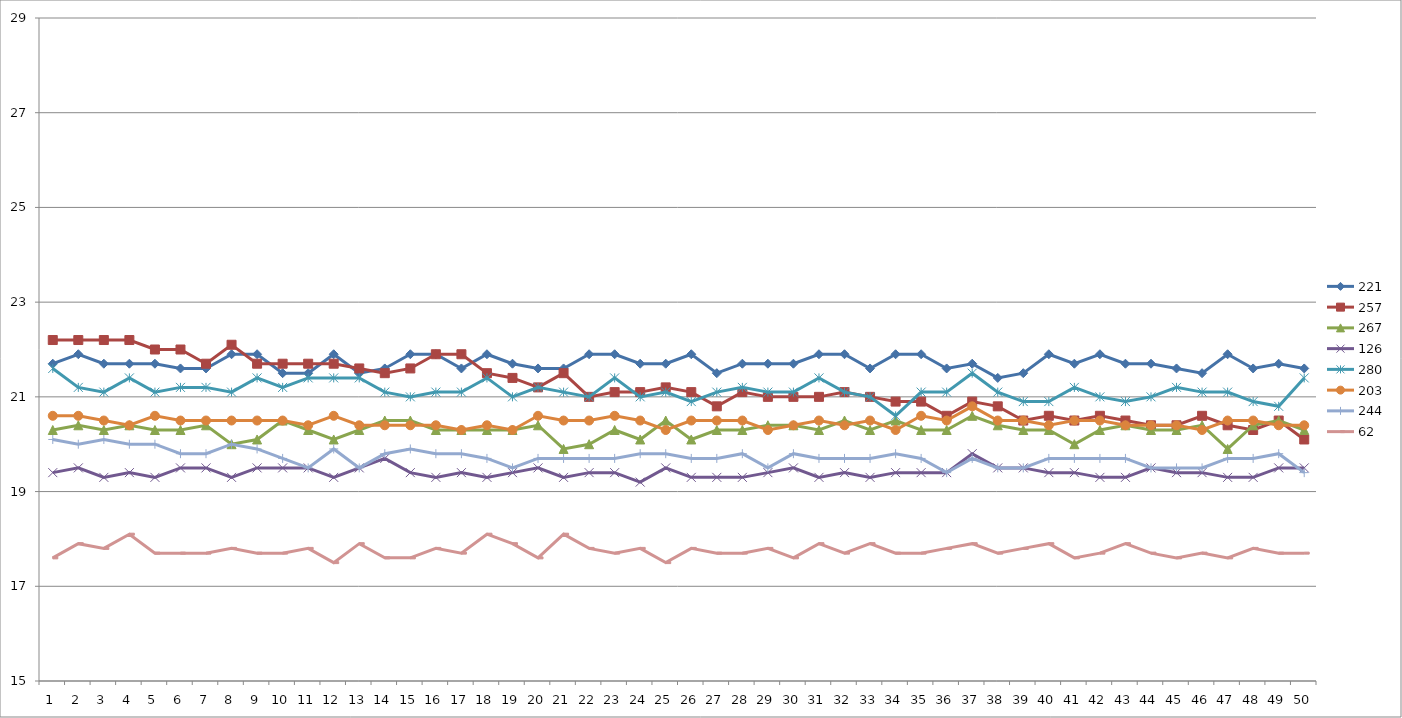
| Category | 221 | 257 | 267 | 126 | 280 | 203 | 244 | 62 |
|---|---|---|---|---|---|---|---|---|
| 0 | 21.7 | 22.2 | 20.3 | 19.4 | 21.6 | 20.6 | 20.1 | 17.6 |
| 1 | 21.9 | 22.2 | 20.4 | 19.5 | 21.2 | 20.6 | 20 | 17.9 |
| 2 | 21.7 | 22.2 | 20.3 | 19.3 | 21.1 | 20.5 | 20.1 | 17.8 |
| 3 | 21.7 | 22.2 | 20.4 | 19.4 | 21.4 | 20.4 | 20 | 18.1 |
| 4 | 21.7 | 22 | 20.3 | 19.3 | 21.1 | 20.6 | 20 | 17.7 |
| 5 | 21.6 | 22 | 20.3 | 19.5 | 21.2 | 20.5 | 19.8 | 17.7 |
| 6 | 21.6 | 21.7 | 20.4 | 19.5 | 21.2 | 20.5 | 19.8 | 17.7 |
| 7 | 21.9 | 22.1 | 20 | 19.3 | 21.1 | 20.5 | 20 | 17.8 |
| 8 | 21.9 | 21.7 | 20.1 | 19.5 | 21.4 | 20.5 | 19.9 | 17.7 |
| 9 | 21.5 | 21.7 | 20.5 | 19.5 | 21.2 | 20.5 | 19.7 | 17.7 |
| 10 | 21.5 | 21.7 | 20.3 | 19.5 | 21.4 | 20.4 | 19.5 | 17.8 |
| 11 | 21.9 | 21.7 | 20.1 | 19.3 | 21.4 | 20.6 | 19.9 | 17.5 |
| 12 | 21.5 | 21.6 | 20.3 | 19.5 | 21.4 | 20.4 | 19.5 | 17.9 |
| 13 | 21.6 | 21.5 | 20.5 | 19.7 | 21.1 | 20.4 | 19.8 | 17.6 |
| 14 | 21.9 | 21.6 | 20.5 | 19.4 | 21 | 20.4 | 19.9 | 17.6 |
| 15 | 21.9 | 21.9 | 20.3 | 19.3 | 21.1 | 20.4 | 19.8 | 17.8 |
| 16 | 21.6 | 21.9 | 20.3 | 19.4 | 21.1 | 20.3 | 19.8 | 17.7 |
| 17 | 21.9 | 21.5 | 20.3 | 19.3 | 21.4 | 20.4 | 19.7 | 18.1 |
| 18 | 21.7 | 21.4 | 20.3 | 19.4 | 21 | 20.3 | 19.5 | 17.9 |
| 19 | 21.6 | 21.2 | 20.4 | 19.5 | 21.2 | 20.6 | 19.7 | 17.6 |
| 20 | 21.6 | 21.5 | 19.9 | 19.3 | 21.1 | 20.5 | 19.7 | 18.1 |
| 21 | 21.9 | 21 | 20 | 19.4 | 21 | 20.5 | 19.7 | 17.8 |
| 22 | 21.9 | 21.1 | 20.3 | 19.4 | 21.4 | 20.6 | 19.7 | 17.7 |
| 23 | 21.7 | 21.1 | 20.1 | 19.2 | 21 | 20.5 | 19.8 | 17.8 |
| 24 | 21.7 | 21.2 | 20.5 | 19.5 | 21.1 | 20.3 | 19.8 | 17.5 |
| 25 | 21.9 | 21.1 | 20.1 | 19.3 | 20.9 | 20.5 | 19.7 | 17.8 |
| 26 | 21.5 | 20.8 | 20.3 | 19.3 | 21.1 | 20.5 | 19.7 | 17.7 |
| 27 | 21.7 | 21.1 | 20.3 | 19.3 | 21.2 | 20.5 | 19.8 | 17.7 |
| 28 | 21.7 | 21 | 20.4 | 19.4 | 21.1 | 20.3 | 19.5 | 17.8 |
| 29 | 21.7 | 21 | 20.4 | 19.5 | 21.1 | 20.4 | 19.8 | 17.6 |
| 30 | 21.9 | 21 | 20.3 | 19.3 | 21.4 | 20.5 | 19.7 | 17.9 |
| 31 | 21.9 | 21.1 | 20.5 | 19.4 | 21.1 | 20.4 | 19.7 | 17.7 |
| 32 | 21.6 | 21 | 20.3 | 19.3 | 21 | 20.5 | 19.7 | 17.9 |
| 33 | 21.9 | 20.9 | 20.5 | 19.4 | 20.6 | 20.3 | 19.8 | 17.7 |
| 34 | 21.9 | 20.9 | 20.3 | 19.4 | 21.1 | 20.6 | 19.7 | 17.7 |
| 35 | 21.6 | 20.6 | 20.3 | 19.4 | 21.1 | 20.5 | 19.4 | 17.8 |
| 36 | 21.7 | 20.9 | 20.6 | 19.8 | 21.5 | 20.8 | 19.7 | 17.9 |
| 37 | 21.4 | 20.8 | 20.4 | 19.5 | 21.1 | 20.5 | 19.5 | 17.7 |
| 38 | 21.5 | 20.5 | 20.3 | 19.5 | 20.9 | 20.5 | 19.5 | 17.8 |
| 39 | 21.9 | 20.6 | 20.3 | 19.4 | 20.9 | 20.4 | 19.7 | 17.9 |
| 40 | 21.7 | 20.5 | 20 | 19.4 | 21.2 | 20.5 | 19.7 | 17.6 |
| 41 | 21.9 | 20.6 | 20.3 | 19.3 | 21 | 20.5 | 19.7 | 17.7 |
| 42 | 21.7 | 20.5 | 20.4 | 19.3 | 20.9 | 20.4 | 19.7 | 17.9 |
| 43 | 21.7 | 20.4 | 20.3 | 19.5 | 21 | 20.4 | 19.5 | 17.7 |
| 44 | 21.6 | 20.4 | 20.3 | 19.4 | 21.2 | 20.4 | 19.5 | 17.6 |
| 45 | 21.5 | 20.6 | 20.4 | 19.4 | 21.1 | 20.3 | 19.5 | 17.7 |
| 46 | 21.9 | 20.4 | 19.9 | 19.3 | 21.1 | 20.5 | 19.7 | 17.6 |
| 47 | 21.6 | 20.3 | 20.4 | 19.3 | 20.9 | 20.5 | 19.7 | 17.8 |
| 48 | 21.7 | 20.5 | 20.5 | 19.5 | 20.8 | 20.4 | 19.8 | 17.7 |
| 49 | 21.6 | 20.1 | 20.3 | 19.5 | 21.4 | 20.4 | 19.4 | 17.7 |